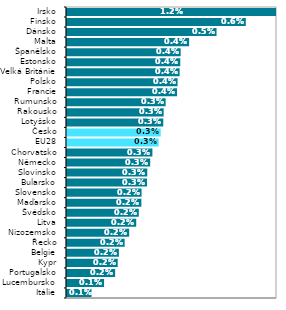
| Category | Series 0 |
|---|---|
| Itálie | 0.001 |
| Lucembursko | 0.001 |
| Portugalsko | 0.002 |
| Kypr | 0.002 |
| Belgie | 0.002 |
| Řecko | 0.002 |
| Nizozemsko | 0.002 |
| Litva | 0.002 |
| Švédsko | 0.002 |
| Maďarsko | 0.002 |
| Slovensko | 0.002 |
| Bularsko | 0.003 |
| Slovinsko | 0.003 |
| Německo | 0.003 |
| Chorvatsko | 0.003 |
| EU28 | 0.003 |
| Česko | 0.003 |
| Lotyšsko | 0.003 |
| Rakousko | 0.003 |
| Rumunsko | 0.003 |
| Francie | 0.004 |
| Polsko | 0.004 |
| Velká Británie | 0.004 |
| Estonsko | 0.004 |
| Španělsko | 0.004 |
| Malta | 0.004 |
| Dánsko | 0.005 |
| Finsko | 0.006 |
| Irsko | 0.012 |